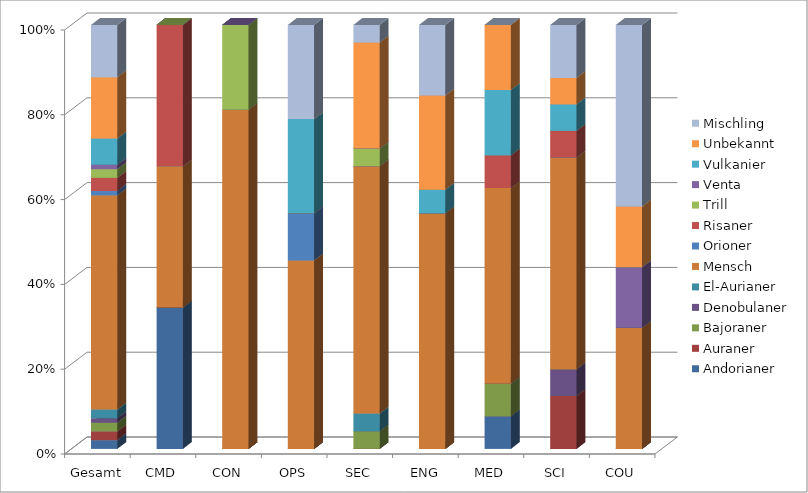
| Category | Andorianer | Auraner | Bajoraner | Denobulaner | El-Aurianer | Mensch | Orioner | Risaner | Trill | Venta | Vulkanier | Unbekannt | Mischling |
|---|---|---|---|---|---|---|---|---|---|---|---|---|---|
| 0 | 0.021 | 0.021 | 0.021 | 0.01 | 0.021 | 0.505 | 0.01 | 0.031 | 0.021 | 0.01 | 0.062 | 0.144 | 0.124 |
| 1 | 0.333 | 0 | 0 | 0 | 0 | 0.333 | 0 | 0.333 | 0 | 0 | 0 | 0 | 0 |
| 2 | 0 | 0 | 0 | 0 | 0 | 0.8 | 0 | 0 | 0.2 | 0 | 0 | 0 | 0 |
| 3 | 0 | 0 | 0 | 0 | 0 | 0.444 | 0.111 | 0 | 0 | 0 | 0.222 | 0 | 0.222 |
| 4 | 0 | 0 | 0.042 | 0 | 0.042 | 0.583 | 0 | 0 | 0.042 | 0 | 0 | 0.25 | 0.042 |
| 5 | 0 | 0 | 0 | 0 | 0 | 0.556 | 0 | 0 | 0 | 0 | 0.056 | 0.222 | 0.167 |
| 6 | 0.077 | 0 | 0.077 | 0 | 0 | 0.462 | 0 | 0.077 | 0 | 0 | 0.154 | 0.154 | 0 |
| 7 | 0 | 0.125 | 0 | 0.062 | 0 | 0.5 | 0 | 0.062 | 0 | 0 | 0.062 | 0.062 | 0.125 |
| 8 | 0 | 0 | 0 | 0 | 0 | 0.286 | 0 | 0 | 0 | 0.143 | 0 | 0.143 | 0.429 |